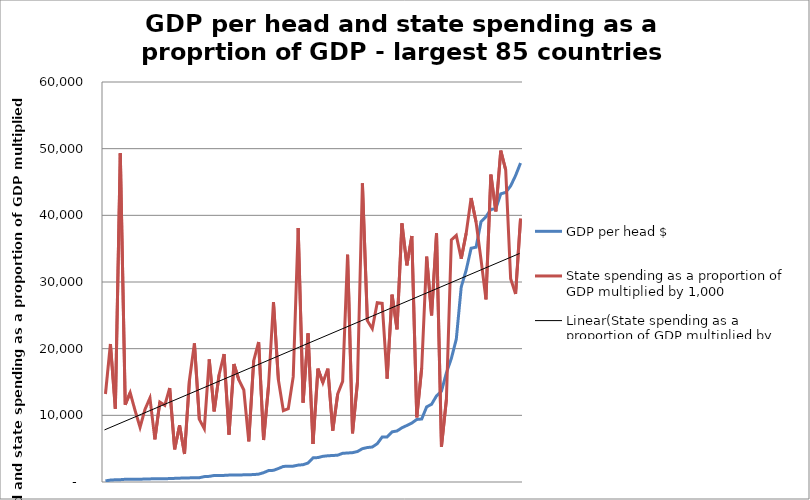
| Category | GDP per head $ | State spending as a proportion of GDP multiplied by 1,000 |
|---|---|---|
| 0 | 163.799 | 13200 |
| 1 | 291.231 | 20700 |
| 2 | 331.068 | 11000 |
| 3 | 347.754 | 49300 |
| 4 | 407.973 | 11600 |
| 5 | 420.021 | 13400 |
| 6 | 424.452 | 10700 |
| 7 | 425.61 | 8200 |
| 8 | 437.043 | 10900 |
| 9 | 465.736 | 12600 |
| 10 | 482.193 | 6400 |
| 11 | 495.56 | 12000 |
| 12 | 497.636 | 11500 |
| 13 | 510.363 | 14100 |
| 14 | 545.588 | 4900 |
| 15 | 574.791 | 8500 |
| 16 | 607.947 | 4200 |
| 17 | 617.552 | 15300 |
| 18 | 637.406 | 20800 |
| 19 | 643.698 | 9400 |
| 20 | 806.211 | 8000 |
| 21 | 847.449 | 18400 |
| 22 | 976.551 | 10600 |
| 23 | 980.614 | 16100 |
| 24 | 990.592 | 19200 |
| 25 | 1036.032 | 7100 |
| 26 | 1040.982 | 17700 |
| 27 | 1043.067 | 15300 |
| 28 | 1076.812 | 13800 |
| 29 | 1095.672 | 6100 |
| 30 | 1113.338 | 18200 |
| 31 | 1180.83 | 21000 |
| 32 | 1396.537 | 6300 |
| 33 | 1712.529 | 14400 |
| 34 | 1749.576 | 27000 |
| 35 | 2024.498 | 15300 |
| 36 | 2333.704 | 10700 |
| 37 | 2370.406 | 11000 |
| 38 | 2379.536 | 15800 |
| 39 | 2533.191 | 38100 |
| 40 | 2594.422 | 11900 |
| 41 | 2845.506 | 22300 |
| 42 | 3620.281 | 5700 |
| 43 | 3665.074 | 17000 |
| 44 | 3850.652 | 14900 |
| 45 | 3934.695 | 17000 |
| 46 | 3974.819 | 7700 |
| 47 | 4022.746 | 13200 |
| 48 | 4303.995 | 15100 |
| 49 | 4350.649 | 34100 |
| 50 | 4402.088 | 7300 |
| 51 | 4571.149 | 15000 |
| 52 | 5000.893 | 44800 |
| 53 | 5172.159 | 24200 |
| 54 | 5246.142 | 23000 |
| 55 | 5745.034 | 26900 |
| 56 | 6748.163 | 26800 |
| 57 | 6765.35 | 15500 |
| 58 | 7523.526 | 28100 |
| 59 | 7653.2 | 22900 |
| 60 | 8134.956 | 38800 |
| 61 | 8479.762 | 32500 |
| 62 | 8842.574 | 36900 |
| 63 | 9382.265 | 9700 |
| 64 | 9447.072 | 17100 |
| 65 | 11271.517 | 33800 |
| 66 | 11660.79 | 25000 |
| 67 | 12923.2 | 37300 |
| 68 | 13623.968 | 5300 |
| 69 | 16384.938 | 12400 |
| 70 | 18531.202 | 36300 |
| 71 | 21427.228 | 37000 |
| 72 | 29258.801 | 33500 |
| 73 | 31776.35 | 37300 |
| 74 | 35065.064 | 42600 |
| 75 | 35221.262 | 39000 |
| 76 | 39019.831 | 33400 |
| 77 | 39783.342 | 27400 |
| 78 | 40888.047 | 46100 |
| 79 | 40989.218 | 40600 |
| 80 | 43219.616 | 49700 |
| 81 | 43442.926 | 46800 |
| 82 | 44408.818 | 30500 |
| 83 | 45969.156 | 28200 |
| 84 | 47842.051 | 39500 |